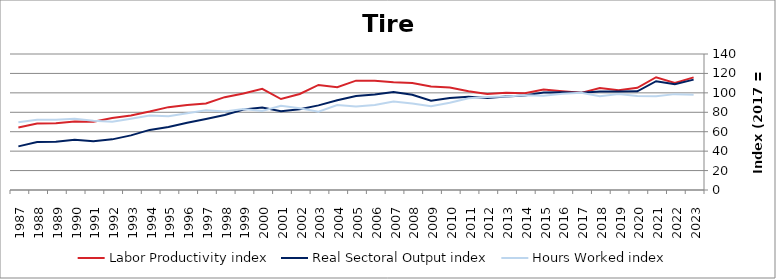
| Category | Labor Productivity index | Real Sectoral Output index | Hours Worked index |
|---|---|---|---|
| 2023.0 | 115.918 | 113.632 | 98.028 |
| 2022.0 | 110.276 | 108.831 | 98.689 |
| 2021.0 | 116.086 | 112.018 | 96.495 |
| 2020.0 | 105.157 | 101.643 | 96.659 |
| 2019.0 | 102.583 | 101.368 | 98.816 |
| 2018.0 | 105.064 | 101.415 | 96.527 |
| 2017.0 | 100 | 100 | 100 |
| 2016.0 | 101.675 | 100.738 | 99.078 |
| 2015.0 | 103.357 | 100.351 | 97.092 |
| 2014.0 | 99.558 | 97.181 | 97.613 |
| 2013.0 | 100.054 | 96.232 | 96.18 |
| 2012.0 | 98.812 | 94.605 | 95.743 |
| 2011.0 | 101.657 | 96.102 | 94.535 |
| 2010.0 | 105.46 | 94.628 | 89.729 |
| 2009.0 | 106.562 | 91.987 | 86.323 |
| 2008.0 | 110.194 | 98.074 | 89.001 |
| 2007.0 | 110.982 | 100.997 | 91.003 |
| 2006.0 | 112.392 | 98.423 | 87.571 |
| 2005.0 | 112.576 | 96.853 | 86.033 |
| 2004.0 | 105.797 | 92.454 | 87.388 |
| 2003.0 | 108.116 | 87.098 | 80.56 |
| 2002.0 | 98.807 | 83.18 | 84.185 |
| 2001.0 | 93.628 | 81.096 | 86.615 |
| 2000.0 | 104.151 | 84.811 | 81.431 |
| 1999.0 | 99.369 | 82.856 | 83.382 |
| 1998.0 | 95.563 | 77.235 | 80.821 |
| 1997.0 | 89.026 | 72.989 | 81.986 |
| 1996.0 | 87.506 | 69.183 | 79.06 |
| 1995.0 | 85.299 | 64.781 | 75.946 |
| 1994.0 | 80.79 | 61.881 | 76.596 |
| 1993.0 | 76.788 | 56.254 | 73.258 |
| 1992.0 | 74.108 | 52.129 | 70.341 |
| 1991.0 | 70.318 | 50.173 | 71.352 |
| 1990.0 | 70.618 | 51.829 | 73.394 |
| 1989.0 | 68.766 | 49.701 | 72.276 |
| 1988.0 | 68.404 | 49.485 | 72.342 |
| 1987.0 | 64.364 | 44.913 | 69.78 |